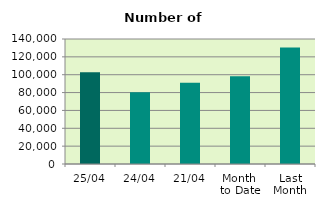
| Category | Series 0 |
|---|---|
| 25/04 | 102874 |
| 24/04 | 80232 |
| 21/04 | 91096 |
| Month 
to Date | 98164.133 |
| Last
Month | 130565.565 |